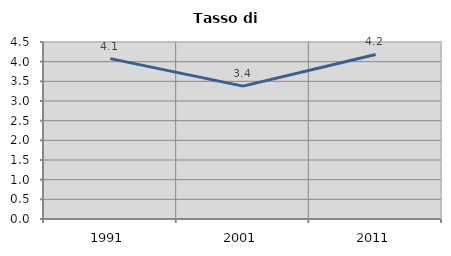
| Category | Tasso di disoccupazione   |
|---|---|
| 1991.0 | 4.078 |
| 2001.0 | 3.378 |
| 2011.0 | 4.183 |